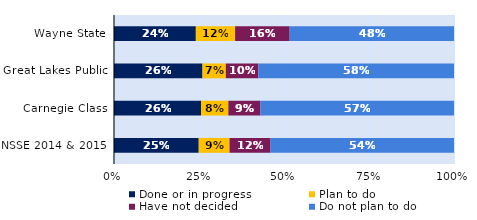
| Category | Done or in progress | Plan to do | Have not decided | Do not plan to do |
|---|---|---|---|---|
| Wayne State | 0.241 | 0.115 | 0.16 | 0.483 |
| Great Lakes Public | 0.26 | 0.069 | 0.095 | 0.576 |
| Carnegie Class | 0.256 | 0.08 | 0.095 | 0.569 |
| NSSE 2014 & 2015 | 0.249 | 0.091 | 0.121 | 0.54 |